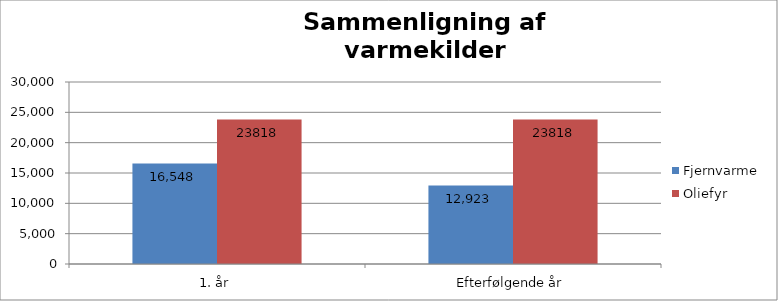
| Category | Fjernvarme | Oliefyr |
|---|---|---|
| 1. år | 16548.454 | 23818 |
| Efterfølgende år | 12923.454 | 23818 |